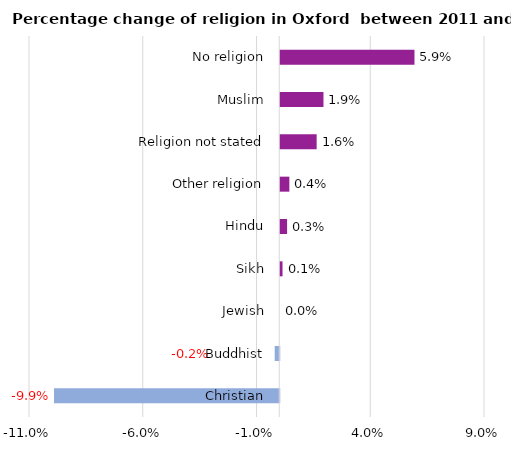
| Category | Change from Census 2011 |
|---|---|
| Christian | -0.099 |
| Buddhist | -0.002 |
| Jewish | 0 |
| Sikh | 0.001 |
| Hindu | 0.003 |
| Other religion | 0.004 |
| Religion not stated | 0.016 |
| Muslim | 0.019 |
| No religion | 0.059 |